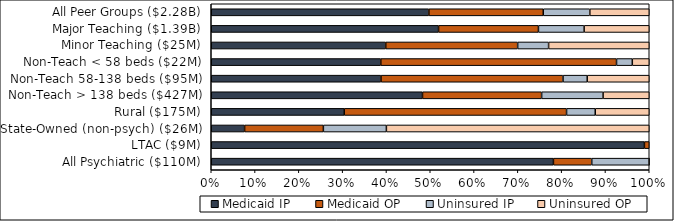
| Category | Medicaid IP | Medicaid OP | Uninsured IP | Uninsured OP |
|---|---|---|---|---|
| All Peer Groups ($2.28B) | 0.497 | 0.261 | 0.106 | 0.136 |
| Major Teaching ($1.39B) | 0.519 | 0.228 | 0.104 | 0.149 |
| Minor Teaching ($25M) | 0.398 | 0.301 | 0.071 | 0.23 |
| Non-Teach < 58 beds ($22M) | 0.387 | 0.538 | 0.036 | 0.039 |
| Non-Teach 58-138 beds ($95M) | 0.388 | 0.416 | 0.055 | 0.142 |
| Non-Teach > 138 beds ($427M) | 0.482 | 0.272 | 0.14 | 0.105 |
| Rural ($175M) | 0.304 | 0.508 | 0.066 | 0.123 |
| State-Owned (non-psych) ($26M) | 0.076 | 0.18 | 0.144 | 0.6 |
| LTAC ($9M) | 0.989 | 0.011 | 0 | 0 |
| All Psychiatric ($110M) | 0.781 | 0.087 | 0.131 | 0 |